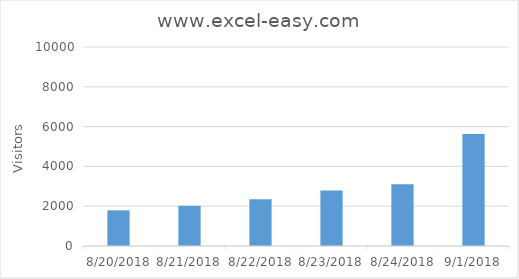
| Category | www.excel-easy.com |
|---|---|
| 8/20/18 | 1792 |
| 8/21/18 | 2022 |
| 8/22/18 | 2345 |
| 8/23/18 | 2785 |
| 8/24/18 | 3103 |
| 9/1/18 | 5626 |